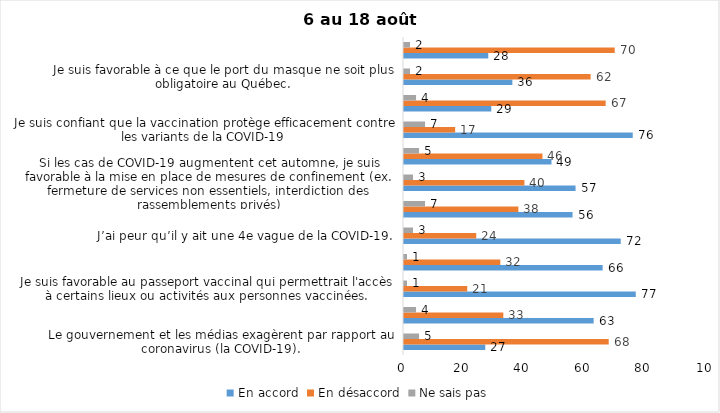
| Category | En accord | En désaccord | Ne sais pas |
|---|---|---|---|
| Le gouvernement et les médias exagèrent par rapport au coronavirus (la COVID-19). | 27 | 68 | 5 |
| J’ai peur que le système de santé soit débordé par les cas de COVID-19 suite au "déconfinement" | 63 | 33 | 4 |
| Je suis favorable au passeport vaccinal qui permettrait l'accès à certains lieux ou activités aux personnes vaccinées. | 77 | 21 | 1 |
| Malgré la levée des mesures de confinement, je préfère limiter mes contacts avec d’autres personnes (par ex., en évitant les activités sociales et de groupes) | 66 | 32 | 1 |
| J’ai peur qu’il y ait une 4e vague de la COVID-19. | 72 | 24 | 3 |
| Dans les régions en zone verte, le risque d’attraper la COVID-19 est minime. | 56 | 38 | 7 |
| Si les cas de COVID-19 augmentent cet automne, je suis favorable à la mise en place de mesures de confinement (ex. fermeture de services non essentiels, interdiction des rassemblements privés) | 57 | 40 | 3 |
| Je suis inquiet de contracter le variant Delta de la Covid-19 | 49 | 46 | 5 |
| Je suis confiant que la vaccination protège efficacement contre les variants de la COVID-19 | 76 | 17 | 7 |
| En raison de la baisse des cas de COID-19 je pense que le gouvernement du Québec devrait mettre fin à l’état d’urgence sanitaire | 29 | 67 | 4 |
| Je suis favorable à ce que le port du masque ne soit plus obligatoire au Québec. | 36 | 62 | 2 |
| Étant donné la progression de la vaccination, je pense qu’il est moins important de suivre les mesures de prévention. | 28 | 70 | 2 |